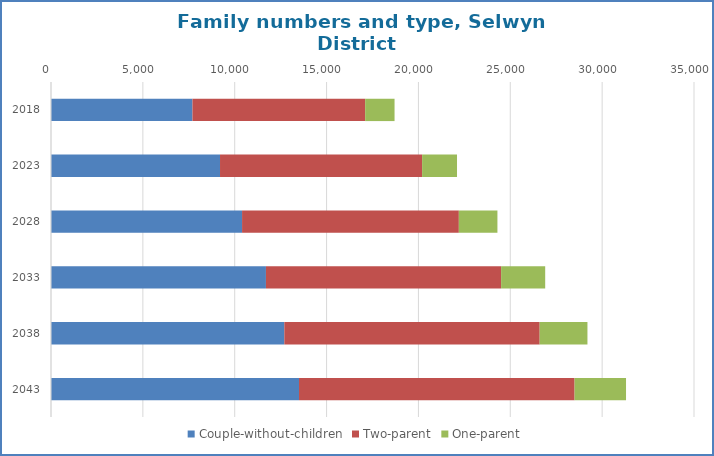
| Category | Couple-without-children | Two-parent | One-parent |
|---|---|---|---|
| 2018.0 | 7700 | 9400 | 1600 |
| 2023.0 | 9200 | 11000 | 1900 |
| 2028.0 | 10400 | 11800 | 2100 |
| 2033.0 | 11700 | 12800 | 2400 |
| 2038.0 | 12700 | 13900 | 2600 |
| 2043.0 | 13500 | 15000 | 2800 |